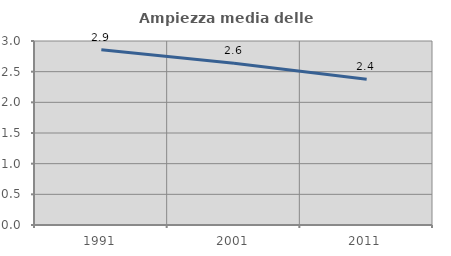
| Category | Ampiezza media delle famiglie |
|---|---|
| 1991.0 | 2.856 |
| 2001.0 | 2.639 |
| 2011.0 | 2.378 |